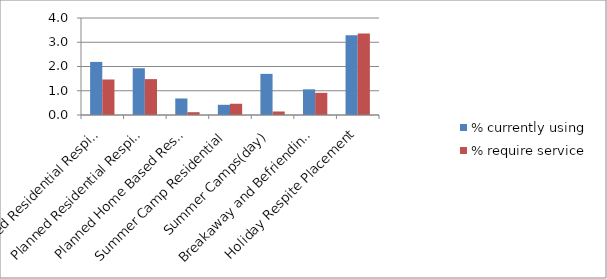
| Category | % currently using | % require service |
|---|---|---|
| Planned Residential Respite with High Support | 2.189 | 1.464 |
| Planned Residential Respite with Low Support | 1.928 | 1.479 |
| Planned Home Based Respite | 0.681 | 0.116 |
| Summer Camp Residential | 0.42 | 0.464 |
| Summer Camps(day) | 1.696 | 0.145 |
| Breakaway and Befriending Schemes | 1.058 | 0.913 |
| Holiday Respite Placement | 3.291 | 3.364 |